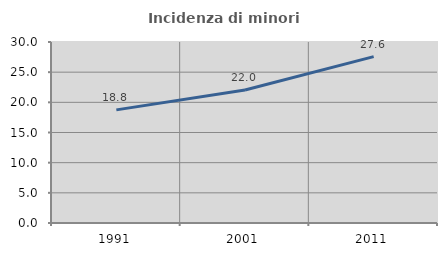
| Category | Incidenza di minori stranieri |
|---|---|
| 1991.0 | 18.75 |
| 2001.0 | 22.034 |
| 2011.0 | 27.581 |